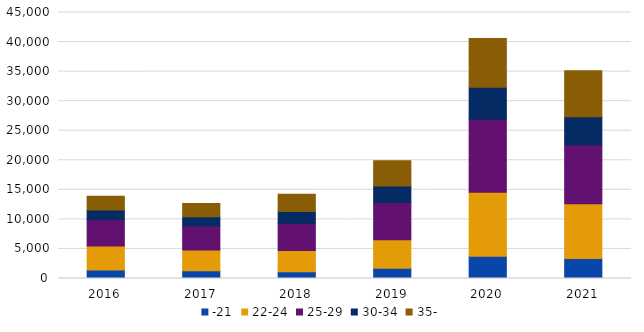
| Category | -21 | 22-24 | 25-29 | 30-34 | 35- |
|---|---|---|---|---|---|
| 2016.0 | 1446 | 4050 | 4428 | 1685 | 2286 |
| 2017.0 | 1300 | 3516 | 4083 | 1540 | 2255 |
| 2018.0 | 1156 | 3562 | 4642 | 1966 | 2923 |
| 2019.0 | 1744 | 4814 | 6286 | 2795 | 4279 |
| 2020.0 | 3749 | 10829 | 12383 | 5403 | 8241 |
| 2021.0 | 3398 | 9257 | 9915 | 4807 | 7789 |